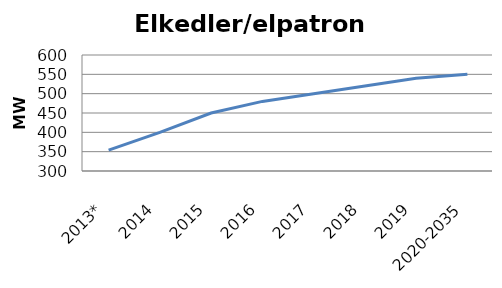
| Category | Elkedler/elpatroner |
|---|---|
| 2013* | 354 |
| 2014 | 400 |
| 2015 | 450 |
| 2016 | 480 |
| 2017 | 500 |
| 2018 | 520 |
| 2019 | 540 |
| 2020-2035 | 550 |